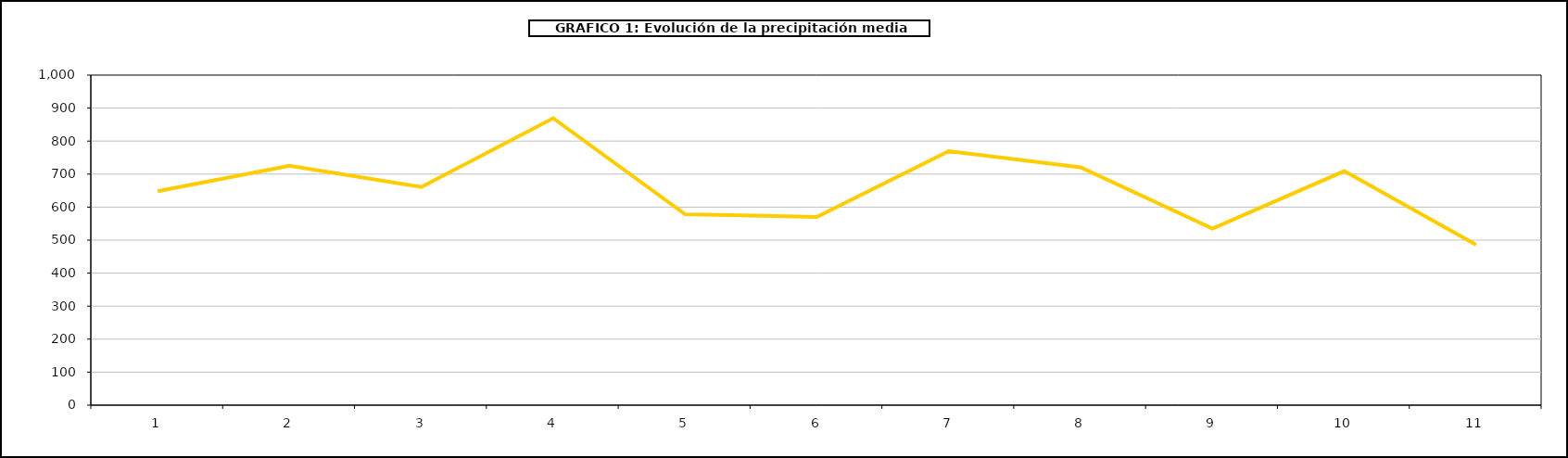
| Category | Series 0 |
|---|---|
| 0 | 648 |
| 1 | 725 |
| 2 | 661 |
| 3 | 869.377 |
| 4 | 578.444 |
| 5 | 570.087 |
| 6 | 769.551 |
| 7 | 720.348 |
| 8 | 535.081 |
| 9 | 709 |
| 10 | 486 |